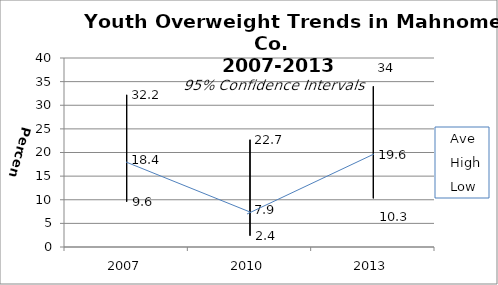
| Category | Ave | High | Low |
|---|---|---|---|
| 2007.0 | 18.4 | 32.2 | 9.6 |
| 2010.0 | 7.9 | 22.7 | 2.4 |
| 2013.0 | 19.6 | 34 | 10.3 |